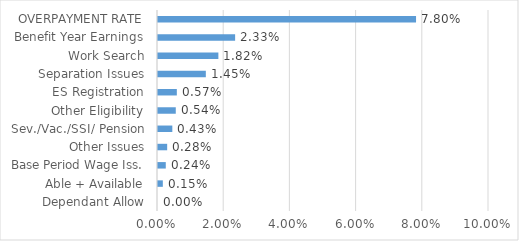
| Category | Series 0 |
|---|---|
| Dependant Allow | 0 |
| Able + Available | 0.001 |
| Base Period Wage Iss. | 0.002 |
| Other Issues | 0.003 |
| Sev./Vac./SSI/ Pension | 0.004 |
| Other Eligibility | 0.005 |
| ES Registration | 0.006 |
| Separation Issues | 0.014 |
| Work Search | 0.018 |
| Benefit Year Earnings | 0.023 |
| OVERPAYMENT RATE | 0.078 |